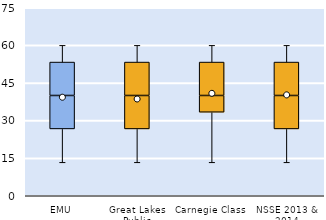
| Category | 25th | 50th | 75th |
|---|---|---|---|
| EMU | 26.667 | 13.333 | 13.333 |
| Great Lakes Public | 26.667 | 13.333 | 13.333 |
| Carnegie Class | 33.333 | 6.667 | 13.333 |
| NSSE 2013 & 2014 | 26.667 | 13.333 | 13.333 |